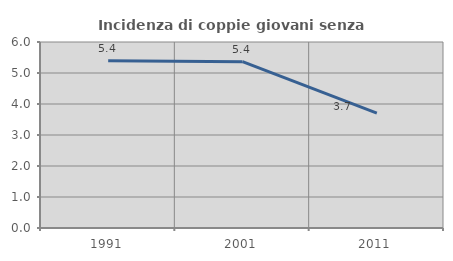
| Category | Incidenza di coppie giovani senza figli |
|---|---|
| 1991.0 | 5.398 |
| 2001.0 | 5.366 |
| 2011.0 | 3.704 |